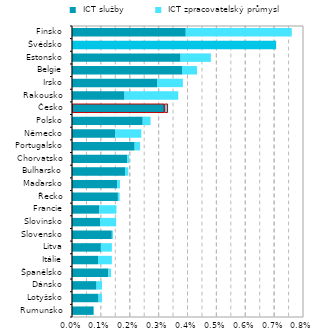
| Category |  ICT služby |  ICT zpracovatelský průmysl |
|---|---|---|
| Rumunsko | 0.001 | 0 |
| Lotyšsko | 0.001 | 0 |
| Dánsko | 0.001 | 0 |
| Španělsko | 0.001 | 0 |
| Itálie | 0.001 | 0 |
| Litva | 0.001 | 0 |
| Slovensko | 0.001 | 0 |
| Slovinsko | 0.001 | 0.001 |
| Francie | 0.001 | 0.001 |
| Řecko | 0.002 | 0 |
| Maďarsko | 0.002 | 0 |
| Bulharsko | 0.002 | 0 |
| Chorvatsko | 0.002 | 0 |
| Portugalsko | 0.002 | 0 |
| Německo | 0.002 | 0.001 |
| Polsko | 0.002 | 0 |
| Česko | 0.003 | 0 |
| Rakousko | 0.002 | 0.002 |
| Irsko | 0.003 | 0.001 |
| Belgie | 0.004 | 0.001 |
| Estonsko | 0.004 | 0.001 |
| Švédsko | 0.007 | 0 |
| Finsko | 0.004 | 0.004 |